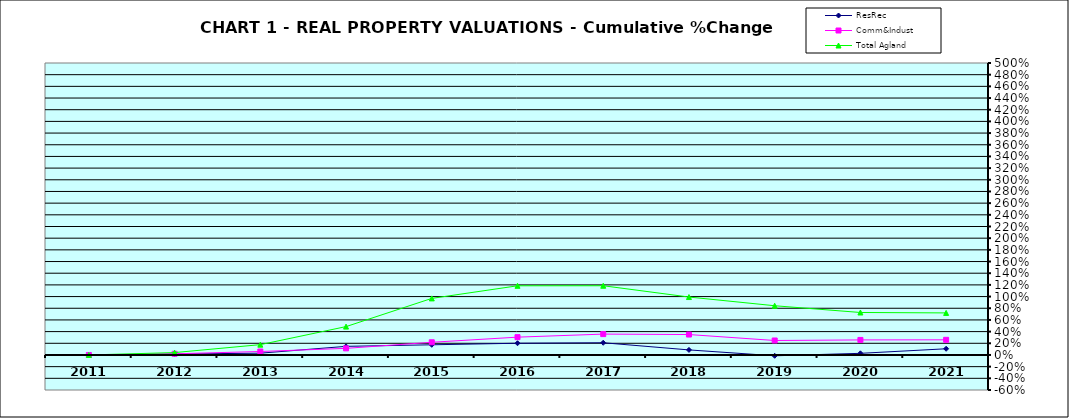
| Category | ResRec | Comm&Indust | Total Agland |
|---|---|---|---|
| 2011.0 | 0 | 0 | 0 |
| 2012.0 | 0.015 | 0.02 | 0.041 |
| 2013.0 | 0.03 | 0.059 | 0.177 |
| 2014.0 | 0.147 | 0.113 | 0.486 |
| 2015.0 | 0.174 | 0.217 | 0.969 |
| 2016.0 | 0.201 | 0.305 | 1.185 |
| 2017.0 | 0.209 | 0.357 | 1.185 |
| 2018.0 | 0.086 | 0.35 | 0.992 |
| 2019.0 | -0.014 | 0.248 | 0.843 |
| 2020.0 | 0.028 | 0.257 | 0.727 |
| 2021.0 | 0.106 | 0.259 | 0.72 |